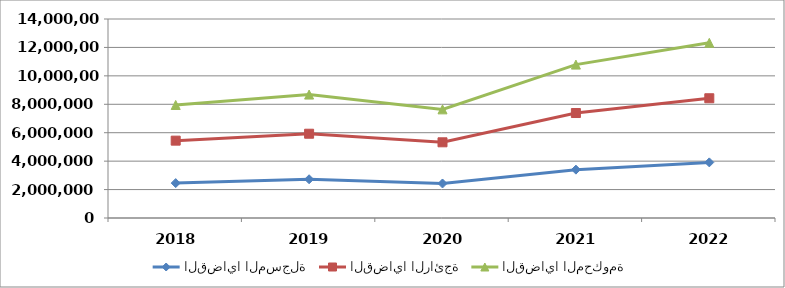
| Category | القضايا المسجلة | القضايا الرائجة | القضايا المحكومة |
|---|---|---|---|
| 2018.0 | 2455457 | 2985931 | 2509918 |
| 2019.0 | 2725834 | 3203085 | 2754326 |
| 2020.0 | 2427489 | 2897920 | 2316741 |
| 2021.0 | 3402023 | 3983264 | 3406846 |
| 2022.0 | 3912474 | 4511653 | 3899835 |